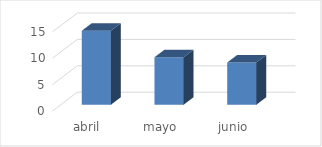
| Category | Series 0 |
|---|---|
| abril | 14 |
| mayo | 9 |
| junio | 8 |